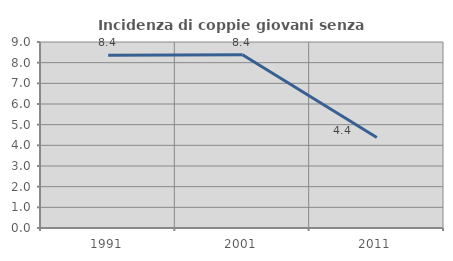
| Category | Incidenza di coppie giovani senza figli |
|---|---|
| 1991.0 | 8.362 |
| 2001.0 | 8.386 |
| 2011.0 | 4.382 |